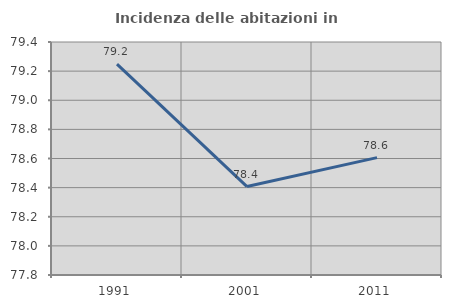
| Category | Incidenza delle abitazioni in proprietà  |
|---|---|
| 1991.0 | 79.248 |
| 2001.0 | 78.407 |
| 2011.0 | 78.606 |